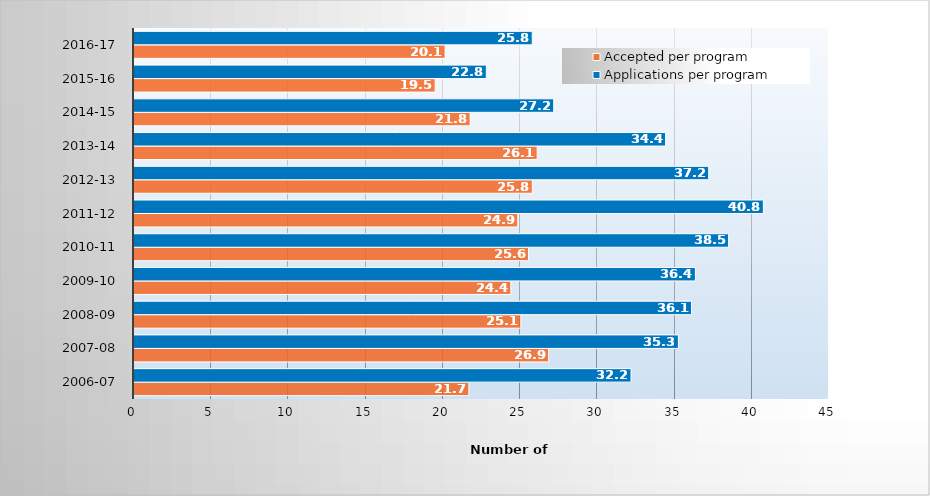
| Category | Accepted per program | Applications per program |
|---|---|---|
| 2006-07 | 21.682 | 32.182 |
| 2007-08 | 26.85 | 35.25 |
| 2008-09 | 25.05 | 36.1 |
| 2009-10 | 24.4 | 36.35 |
| 2010-11 | 25.55 | 38.5 |
| 2011-12 | 24.85 | 40.75 |
| 2012-13 | 25.789 | 37.211 |
| 2013-14 | 26.105 | 34.421 |
| 2014-15 | 21.765 | 27.176 |
| 2015-16 | 19.5 | 22.812 |
| 2016-17 | 20.143 | 25.786 |